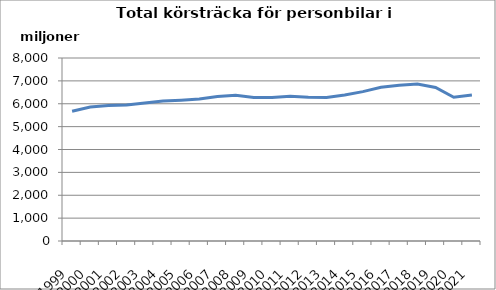
| Category | Series 0 |
|---|---|
| 1999.0 | 5670643852.1 |
| 2000.0 | 5855474348.2 |
| 2001.0 | 5921506460 |
| 2002.0 | 5943992726 |
| 2003.0 | 6037040610 |
| 2004.0 | 6125068678 |
| 2005.0 | 6158036407 |
| 2006.0 | 6207406936 |
| 2007.0 | 6319684828 |
| 2008.0 | 6367674932 |
| 2009.0 | 6272007118 |
| 2010.0 | 6271244185 |
| 2011.0 | 6322594571 |
| 2012.0 | 6280639665.7 |
| 2013.0 | 6278008025 |
| 2014.0 | 6381268446.7 |
| 2015.0 | 6531145878.4 |
| 2016.0 | 6717615860.5 |
| 2017.0 | 6808195546 |
| 2018.0 | 6866374264 |
| 2019.0 | 6714206425 |
| 2020.0 | 6282377816.2 |
| 2021.0 | 6385010928.1 |